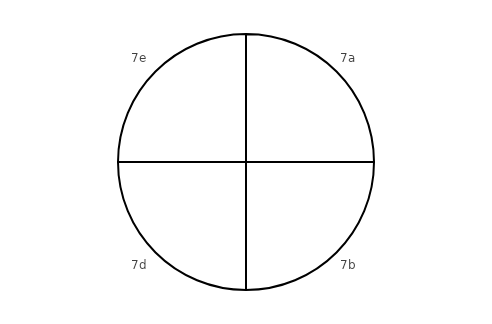
| Category | Sector weight |
|---|---|
| 7a | 1 |
| 7b | 1 |
| 7d | 1 |
| 7e | 1 |